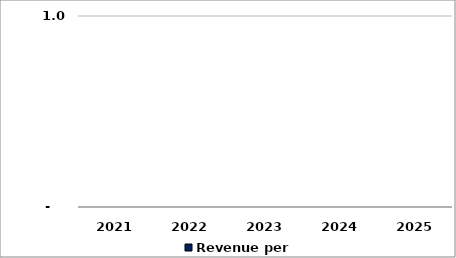
| Category | Revenue per FTE |
|---|---|
| 2021 | 0 |
| 2022 | 0 |
| 2023 | 0 |
| 2024 | 0 |
| 2025 | 0 |